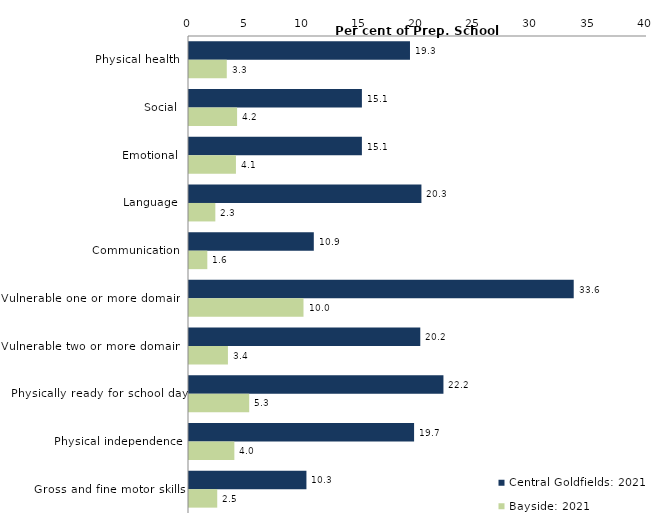
| Category | Central Goldfields: 2021 | Bayside: 2021 |
|---|---|---|
| Physical health | 19.3 | 3.3 |
| Social | 15.1 | 4.2 |
| Emotional | 15.1 | 4.1 |
| Language | 20.3 | 2.3 |
| Communication | 10.9 | 1.6 |
| Vulnerable one or more domains | 33.6 | 10 |
| Vulnerable two or more domains | 20.2 | 3.4 |
| Physically ready for school day | 22.222 | 5.258 |
| Physical independence | 19.658 | 3.961 |
| Gross and fine motor skills | 10.256 | 2.465 |